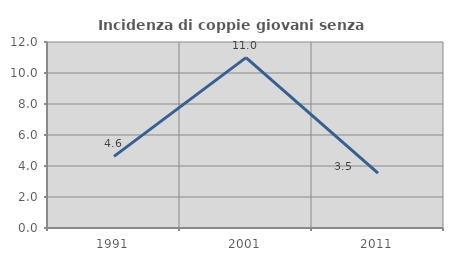
| Category | Incidenza di coppie giovani senza figli |
|---|---|
| 1991.0 | 4.622 |
| 2001.0 | 10.992 |
| 2011.0 | 3.548 |